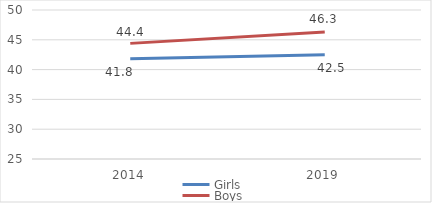
| Category | Girls | Boys |
|---|---|---|
| 2014.0 | 41.8 | 44.4 |
| 2019.0 | 42.5 | 46.3 |